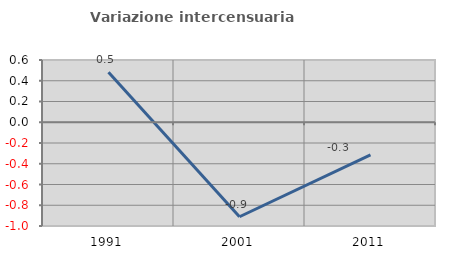
| Category | Variazione intercensuaria annua |
|---|---|
| 1991.0 | 0.483 |
| 2001.0 | -0.911 |
| 2011.0 | -0.314 |